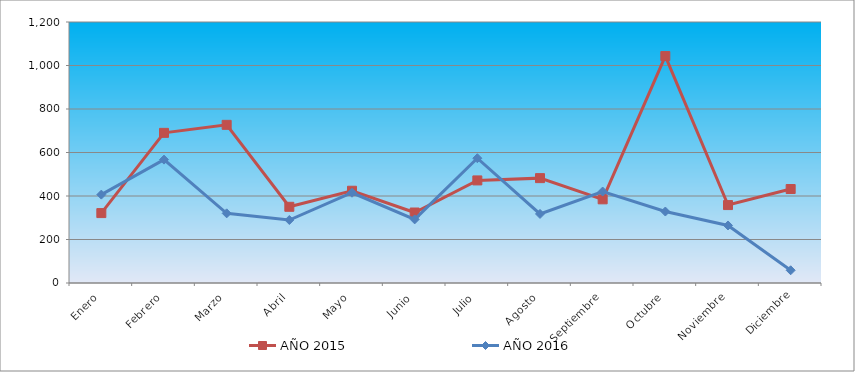
| Category | AÑO 2015 | AÑO 2016 |
|---|---|---|
| Enero | 321.443 | 406.328 |
| Febrero | 690.313 | 567.276 |
| Marzo | 727.199 | 320.26 |
| Abril | 350.426 | 289.626 |
| Mayo | 424.2 | 414.945 |
| Junio | 324.078 | 292.411 |
| Julio | 471.626 | 573.682 |
| Agosto | 482.165 | 317.475 |
| Septiembre | 384.678 | 420.515 |
| Octubre | 1043.373 | 328.614 |
| Noviembre | 358.33 | 264.562 |
| Diciembre | 432.104 | 58.482 |